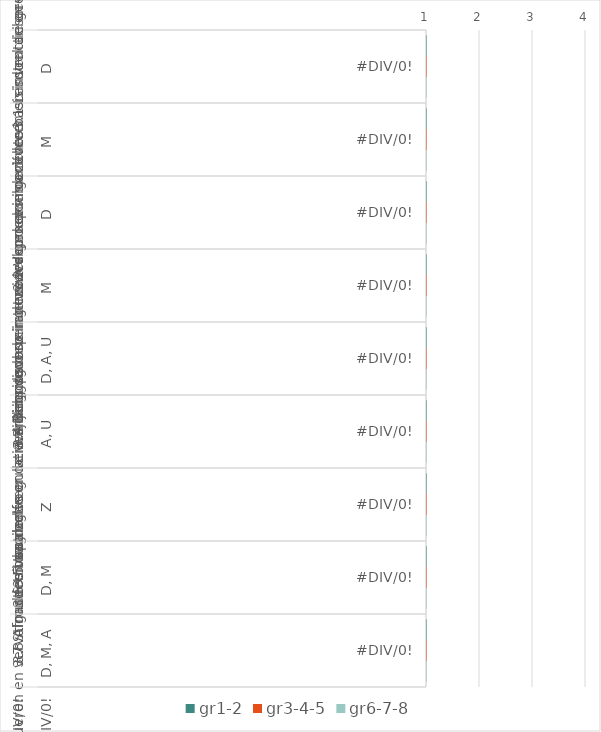
| Category | gr1-2 | gr3-4-5 | gr6-7-8 |
|---|---|---|---|
| 0 | 0 | 0 | 0 |
| 1 | 0 | 0 | 0 |
| 2 | 0 | 0 | 0 |
| 3 | 0 | 0 | 0 |
| 4 | 0 | 0 | 0 |
| 5 | 0 | 0 | 0 |
| 6 | 0 | 0 | 0 |
| 7 | 0 | 0 | 0 |
| 8 | 0 | 0 | 0 |